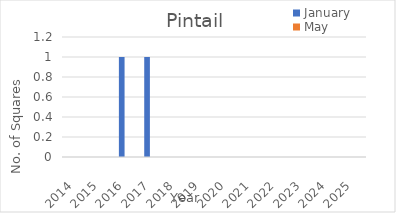
| Category | January | May |
|---|---|---|
| 2014.0 | 0 | 0 |
| 2015.0 | 0 | 0 |
| 2016.0 | 1 | 0 |
| 2017.0 | 1 | 0 |
| 2018.0 | 0 | 0 |
| 2019.0 | 0 | 0 |
| 2020.0 | 0 | 0 |
| 2021.0 | 0 | 0 |
| 2022.0 | 0 | 0 |
| 2023.0 | 0 | 0 |
| 2024.0 | 0 | 0 |
| 2025.0 | 0 | 0 |